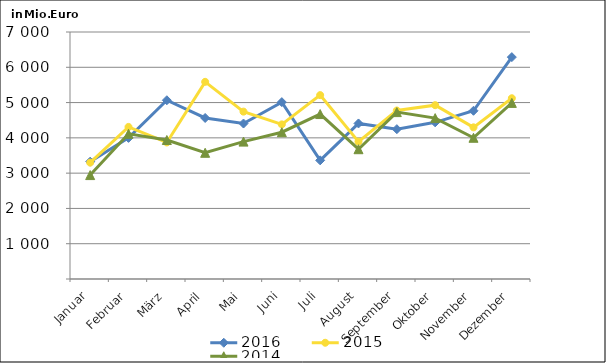
| Category | 2016 | 2015 | 2014 |
|---|---|---|---|
| Januar | 3325.376 | 3298.517 | 2945.073 |
| Februar | 3998.956 | 4309.693 | 4114.543 |
| März | 5065.661 | 3869.705 | 3938.725 |
| April | 4563.606 | 5587.68 | 3576.692 |
| Mai | 4406.354 | 4743.116 | 3893.423 |
| Juni | 5012.648 | 4381.85 | 4160.188 |
| Juli | 3362.848 | 5210.899 | 4674.445 |
| August | 4408.022 | 3894.012 | 3678.421 |
| September | 4246.188 | 4775.056 | 4729.77 |
| Oktober | 4439.936 | 4926.294 | 4559.697 |
| November | 4767.486 | 4297.974 | 4002.537 |
| Dezember | 6288.318 | 5122.134 | 4991.049 |